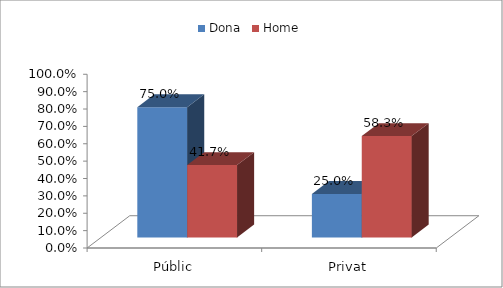
| Category | Dona | Home |
|---|---|---|
| Públic | 0.75 | 0.417 |
| Privat | 0.25 | 0.583 |